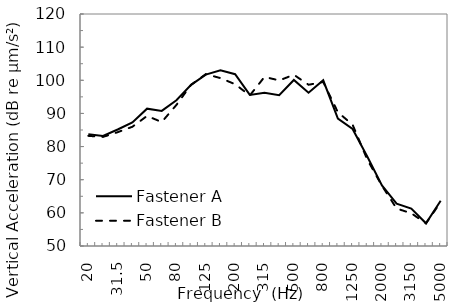
| Category | Fastener A | Fastener B |
|---|---|---|
| 20.0 | 83.743 | 83.231 |
| 25.0 | 83.226 | 82.914 |
| 31.5 | 85.157 | 84.344 |
| 40.0 | 87.275 | 85.974 |
| 50.0 | 91.433 | 89.241 |
| 63.0 | 90.771 | 87.407 |
| 80.0 | 93.974 | 92.563 |
| 100.0 | 98.633 | 98.636 |
| 125.0 | 101.699 | 101.86 |
| 160.0 | 103.009 | 100.661 |
| 200.0 | 101.836 | 98.806 |
| 250.0 | 95.599 | 95.426 |
| 315.0 | 96.242 | 101.018 |
| 400.0 | 95.51 | 99.959 |
| 500.0 | 100.087 | 101.66 |
| 630.0 | 96.227 | 98.648 |
| 800.0 | 99.997 | 99.486 |
| 1000.0 | 88.411 | 90.349 |
| 1250.0 | 85.318 | 86.599 |
| 1600.0 | 77.008 | 76.104 |
| 2000.0 | 68.282 | 68.181 |
| 2500.0 | 62.785 | 61.308 |
| 3150.0 | 61.282 | 59.861 |
| 4000.0 | 56.843 | 56.846 |
| 5000.0 | 63.677 | 63.229 |